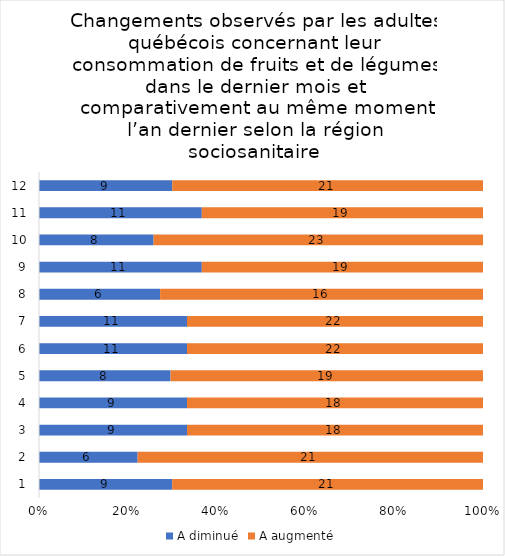
| Category | A diminué | A augmenté |
|---|---|---|
| 0 | 9 | 21 |
| 1 | 6 | 21 |
| 2 | 9 | 18 |
| 3 | 9 | 18 |
| 4 | 8 | 19 |
| 5 | 11 | 22 |
| 6 | 11 | 22 |
| 7 | 6 | 16 |
| 8 | 11 | 19 |
| 9 | 8 | 23 |
| 10 | 11 | 19 |
| 11 | 9 | 21 |